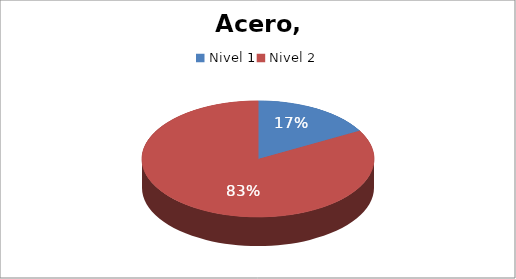
| Category | QxHH |
|---|---|
| Nivel 1 | 4634 |
| Nivel 2 | 22727 |